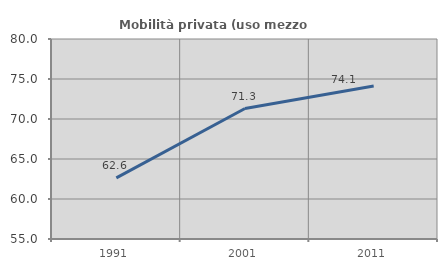
| Category | Mobilità privata (uso mezzo privato) |
|---|---|
| 1991.0 | 62.632 |
| 2001.0 | 71.309 |
| 2011.0 | 74.12 |